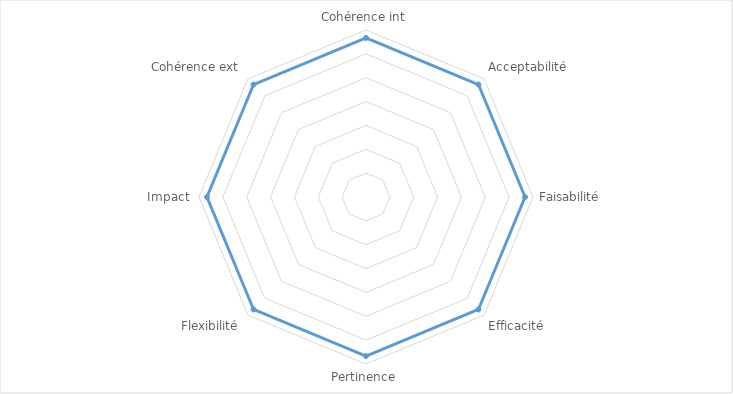
| Category | Series 0 |
|---|---|
| Cohérence int | 0.333 |
| Acceptabilité | 0.333 |
| Faisabilité | 0.333 |
| Efficacité | 0.333 |
| Pertinence | 0.333 |
| Flexibilité | 0.333 |
| Impact | 0.333 |
| Cohérence ext | 0.333 |